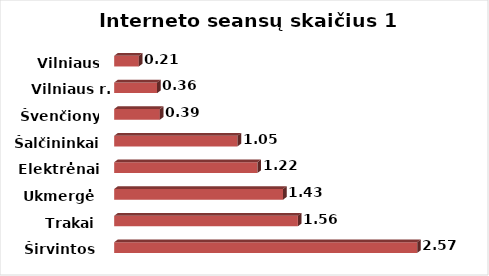
| Category | Series 0 |
|---|---|
| Širvintos | 2.571 |
| Trakai | 1.559 |
| Ukmergė | 1.433 |
| Elektrėnai | 1.215 |
| Šalčininkai | 1.046 |
| Švenčionys | 0.388 |
| Vilniaus r. | 0.364 |
| Vilniaus m. | 0.209 |